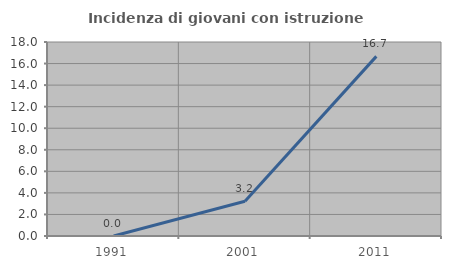
| Category | Incidenza di giovani con istruzione universitaria |
|---|---|
| 1991.0 | 0 |
| 2001.0 | 3.226 |
| 2011.0 | 16.667 |